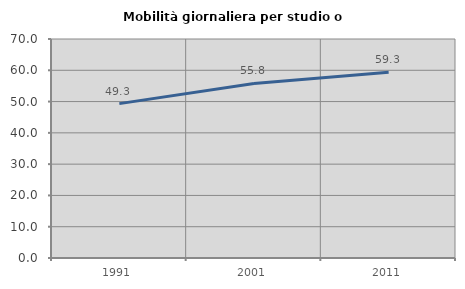
| Category | Mobilità giornaliera per studio o lavoro |
|---|---|
| 1991.0 | 49.346 |
| 2001.0 | 55.786 |
| 2011.0 | 59.346 |